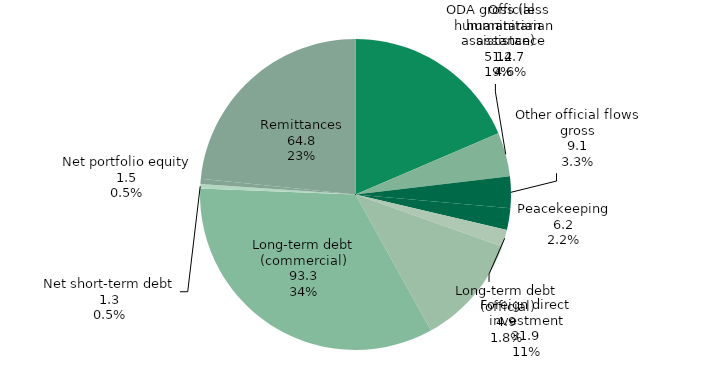
| Category | Series 0 |
|---|---|
| ODA gross (less humanitarian assistance) | 51.4 |
| Official humanitarian assistance | 12.7 |
| Other official flows gross | 9.1 |
| Peacekeeping | 6.2 |
| Long-term debt (official) | 4.9 |
| Foreign direct investment | 31.9 |
| Long-term debt (commercial) | 93.3 |
| Net short-term debt | 1.3 |
| Net portfolio equity | 1.5 |
| Remittances | 64.8 |